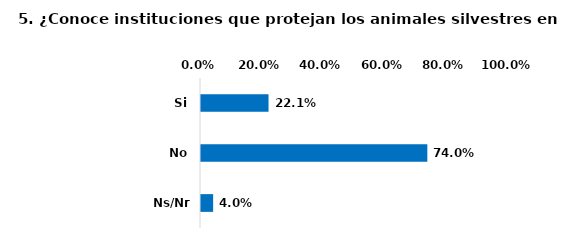
| Category | Series 0 |
|---|---|
| Si | 0.221 |
| No | 0.74 |
| Ns/Nr | 0.04 |